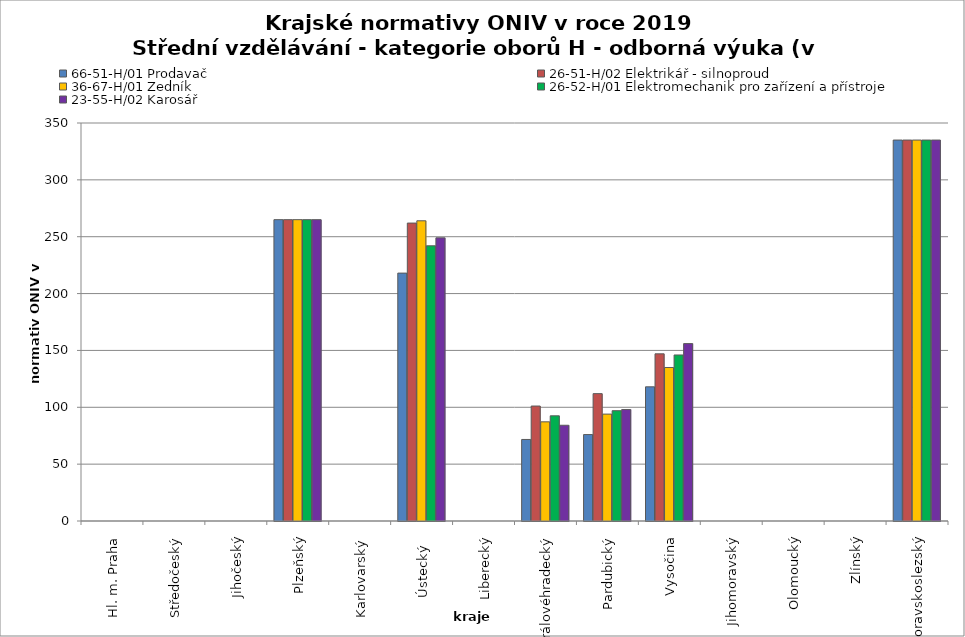
| Category | 66-51-H/01 Prodavač | 26-51-H/02 Elektrikář - silnoproud | 36-67-H/01 Zedník | 26-52-H/01 Elektromechanik pro zařízení a přístroje | 23-55-H/02 Karosář |
|---|---|---|---|---|---|
| Hl. m. Praha | 0 | 0 | 0 | 0 | 0 |
| Středočeský | 0 | 0 | 0 | 0 | 0 |
| Jihočeský | 0 | 0 | 0 | 0 | 0 |
| Plzeňský | 265 | 265 | 265 | 265 | 265 |
| Karlovarský  | 0 | 0 | 0 | 0 | 0 |
| Ústecký   | 218 | 262 | 264 | 242 | 249 |
| Liberecký | 0 | 0 | 0 | 0 | 0 |
| Královéhradecký | 71.7 | 101.1 | 87.2 | 92.5 | 84.2 |
| Pardubický | 76 | 112 | 94 | 97 | 98 |
| Vysočina | 118 | 147 | 135 | 146 | 156 |
| Jihomoravský | 0 | 0 | 0 | 0 | 0 |
| Olomoucký | 0 | 0 | 0 | 0 | 0 |
| Zlínský | 0 | 0 | 0 | 0 | 0 |
| Moravskoslezský | 335 | 335 | 335 | 335 | 335 |